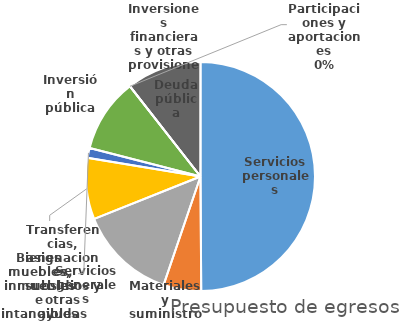
| Category | Series 0 |
|---|---|
| Servicios personales | 264172327.42 |
| Materiales y suministros | 28173163 |
| Servicios generales | 72716569 |
| Transferencias, asignaciones, subsidios y otras ayudas | 45803521 |
| Bienes muebles, inmuebles e intangibles | 7419893 |
| Inversión pública | 55209868 |
| Inversiones financieras y otras provisiones | 0 |
| Participaciones y aportaciones | 0 |
| Deuda pública | 55912546 |